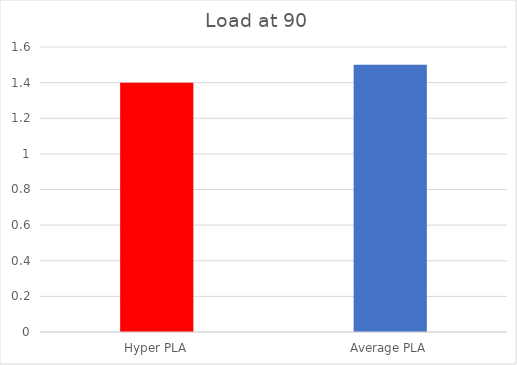
| Category | Load at 90 |
|---|---|
| Hyper PLA | 1.4 |
| Average PLA | 1.5 |